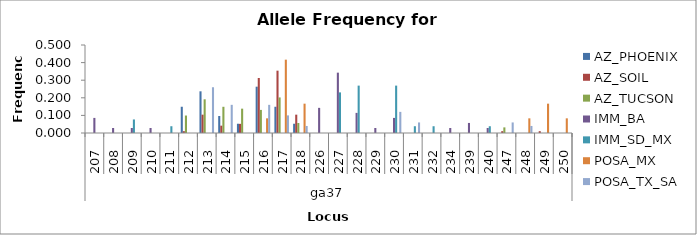
| Category | AZ_PHOENIX | AZ_SOIL | AZ_TUCSON | IMM_BA | IMM_SD_MX | POSA_MX | POSA_TX_SA |
|---|---|---|---|---|---|---|---|
| 0 | 0 | 0 | 0 | 0.086 | 0 | 0 | 0 |
| 1 | 0 | 0 | 0 | 0.029 | 0 | 0 | 0 |
| 2 | 0 | 0 | 0 | 0.029 | 0.077 | 0 | 0 |
| 3 | 0 | 0 | 0 | 0.029 | 0 | 0 | 0 |
| 4 | 0 | 0 | 0 | 0 | 0.038 | 0 | 0 |
| 5 | 0.149 | 0.01 | 0.099 | 0 | 0 | 0 | 0 |
| 6 | 0.237 | 0.104 | 0.191 | 0 | 0 | 0 | 0.26 |
| 7 | 0.096 | 0.042 | 0.149 | 0 | 0 | 0 | 0.16 |
| 8 | 0.053 | 0.052 | 0.138 | 0 | 0 | 0 | 0 |
| 9 | 0.263 | 0.312 | 0.131 | 0 | 0 | 0.083 | 0.16 |
| 10 | 0.149 | 0.354 | 0.202 | 0 | 0 | 0.417 | 0.1 |
| 11 | 0.053 | 0.104 | 0.057 | 0 | 0 | 0.167 | 0.04 |
| 12 | 0 | 0 | 0 | 0.143 | 0 | 0 | 0 |
| 13 | 0 | 0 | 0 | 0.343 | 0.231 | 0 | 0 |
| 14 | 0 | 0 | 0 | 0.114 | 0.269 | 0 | 0 |
| 15 | 0 | 0 | 0 | 0.029 | 0 | 0 | 0 |
| 16 | 0 | 0 | 0 | 0.086 | 0.269 | 0 | 0.12 |
| 17 | 0 | 0 | 0 | 0 | 0.038 | 0 | 0.06 |
| 18 | 0 | 0 | 0 | 0 | 0.038 | 0 | 0 |
| 19 | 0 | 0 | 0 | 0.029 | 0 | 0 | 0 |
| 20 | 0 | 0 | 0 | 0.057 | 0 | 0 | 0 |
| 21 | 0 | 0 | 0 | 0.029 | 0.038 | 0 | 0 |
| 22 | 0 | 0.01 | 0.032 | 0 | 0 | 0 | 0.06 |
| 23 | 0 | 0 | 0 | 0 | 0 | 0.083 | 0.04 |
| 24 | 0 | 0.01 | 0 | 0 | 0 | 0.167 | 0 |
| 25 | 0 | 0 | 0 | 0 | 0 | 0.083 | 0 |